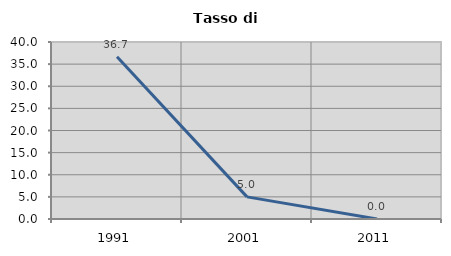
| Category | Tasso di disoccupazione   |
|---|---|
| 1991.0 | 36.667 |
| 2001.0 | 5 |
| 2011.0 | 0 |